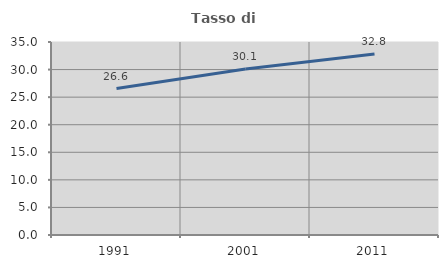
| Category | Tasso di occupazione   |
|---|---|
| 1991.0 | 26.566 |
| 2001.0 | 30.116 |
| 2011.0 | 32.811 |